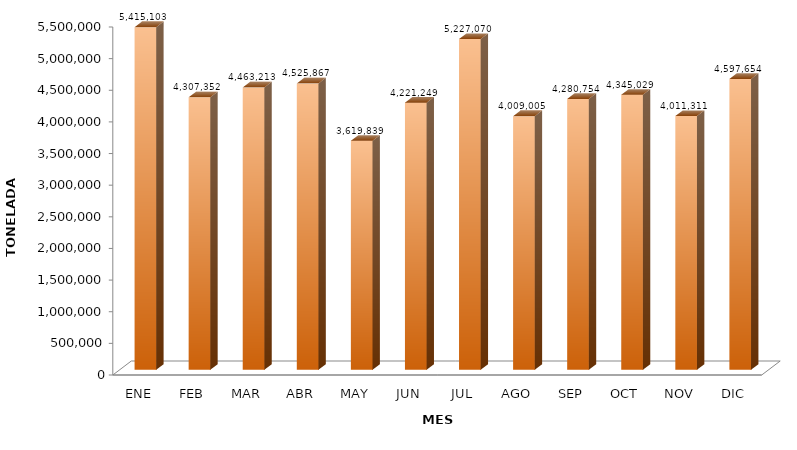
| Category | Series 0 |
|---|---|
| ENE | 5415102.552 |
| FEB | 4307351.919 |
| MAR | 4463212.694 |
| ABR | 4525867.053 |
| MAY | 3619839.407 |
| JUN | 4221248.849 |
| JUL | 5227070.063 |
| AGO | 4009004.775 |
| SEP | 4280753.747 |
| OCT | 4345028.596 |
| NOV | 4011310.606 |
| DIC | 4597654.392 |